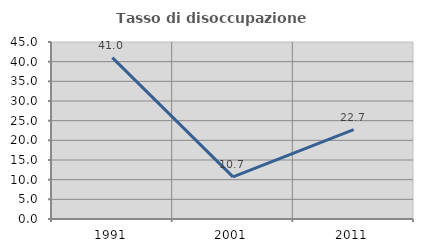
| Category | Tasso di disoccupazione giovanile  |
|---|---|
| 1991.0 | 41.026 |
| 2001.0 | 10.714 |
| 2011.0 | 22.727 |